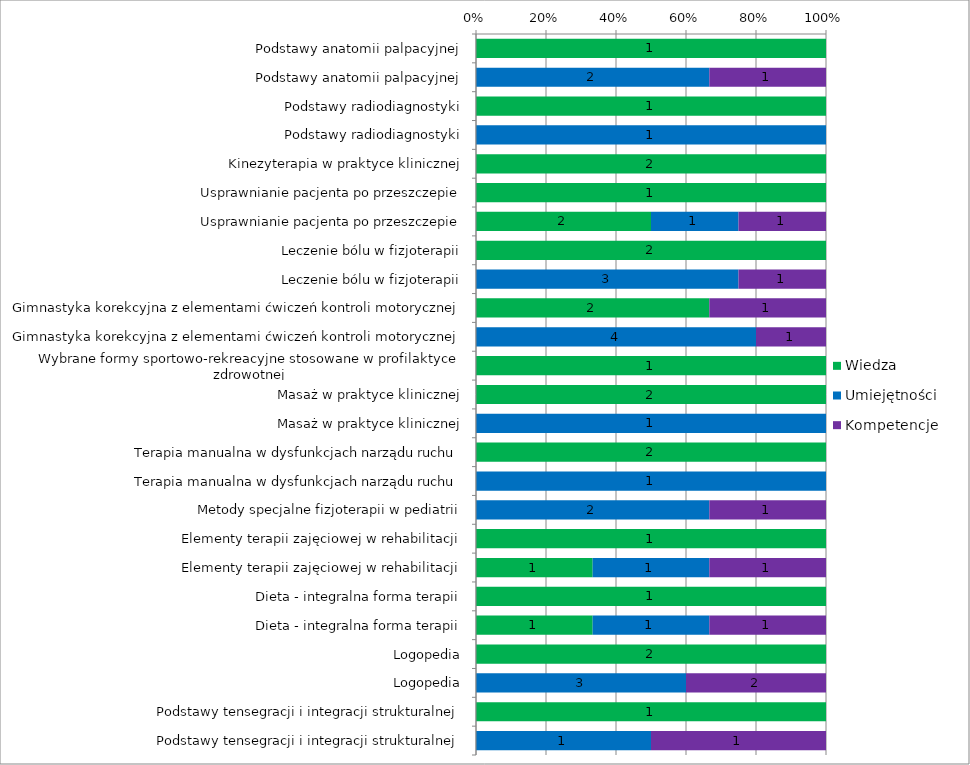
| Category | Wiedza | Umiejętności | Kompetencje |
|---|---|---|---|
| Podstawy anatomii palpacyjnej | 1 | 0 | 0 |
| Podstawy anatomii palpacyjnej | 0 | 2 | 1 |
| Podstawy radiodiagnostyki | 1 | 0 | 0 |
| Podstawy radiodiagnostyki | 0 | 1 | 0 |
| Kinezyterapia w praktyce klinicznej | 2 | 0 | 0 |
| Usprawnianie pacjenta po przeszczepie | 1 | 0 | 0 |
| Usprawnianie pacjenta po przeszczepie | 2 | 1 | 1 |
| Leczenie bólu w fizjoterapii | 2 | 0 | 0 |
| Leczenie bólu w fizjoterapii | 0 | 3 | 1 |
| Gimnastyka korekcyjna z elementami ćwiczeń kontroli motorycznej | 2 | 0 | 1 |
| Gimnastyka korekcyjna z elementami ćwiczeń kontroli motorycznej | 0 | 4 | 1 |
| Wybrane formy sportowo-rekreacyjne stosowane w profilaktyce zdrowotnej  | 1 | 0 | 0 |
| Masaż w praktyce klinicznej | 2 | 0 | 0 |
| Masaż w praktyce klinicznej | 0 | 1 | 0 |
| Terapia manualna w dysfunkcjach narządu ruchu | 2 | 0 | 0 |
| Terapia manualna w dysfunkcjach narządu ruchu | 0 | 1 | 0 |
| Metody specjalne fizjoterapii w pediatrii | 0 | 2 | 1 |
| Elementy terapii zajęciowej w rehabilitacji | 1 | 0 | 0 |
| Elementy terapii zajęciowej w rehabilitacji | 1 | 1 | 1 |
| Dieta - integralna forma terapii | 1 | 0 | 0 |
| Dieta - integralna forma terapii | 1 | 1 | 1 |
| Logopedia | 2 | 0 | 0 |
| Logopedia | 0 | 3 | 2 |
| Podstawy tensegracji i integracji strukturalnej | 1 | 0 | 0 |
| Podstawy tensegracji i integracji strukturalnej | 0 | 1 | 1 |